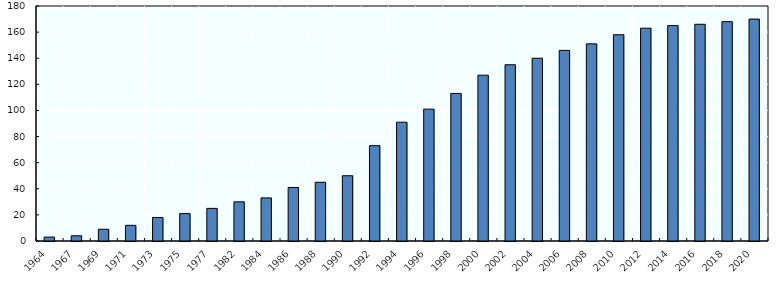
| Category | Series 0 |
|---|---|
| 1964.0 | 3 |
| 1967.0 | 4 |
| 1969.0 | 9 |
| 1971.0 | 12 |
| 1973.0 | 18 |
| 1975.0 | 21 |
| 1977.0 | 25 |
| 1982.0 | 30 |
| 1984.0 | 33 |
| 1986.0 | 41 |
| 1988.0 | 45 |
| 1990.0 | 50 |
| 1992.0 | 73 |
| 1994.0 | 91 |
| 1996.0 | 101 |
| 1998.0 | 113 |
| 2000.0 | 127 |
| 2002.0 | 135 |
| 2004.0 | 140 |
| 2006.0 | 146 |
| 2008.0 | 151 |
| 2010.0 | 158 |
| 2012.0 | 163 |
| 2014.0 | 165 |
| 2016.0 | 166 |
| 2018.0 | 168 |
| 2020.0 | 170 |